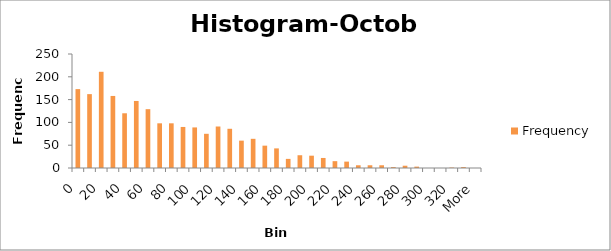
| Category | Frequency |
|---|---|
| 0 | 173 |
| 10 | 162 |
| 20 | 211 |
| 30 | 158 |
| 40 | 120 |
| 50 | 147 |
| 60 | 129 |
| 70 | 98 |
| 80 | 98 |
| 90 | 90 |
| 100 | 89 |
| 110 | 75 |
| 120 | 91 |
| 130 | 86 |
| 140 | 60 |
| 150 | 64 |
| 160 | 49 |
| 170 | 43 |
| 180 | 20 |
| 190 | 28 |
| 200 | 27 |
| 210 | 22 |
| 220 | 15 |
| 230 | 14 |
| 240 | 6 |
| 250 | 6 |
| 260 | 6 |
| 270 | 2 |
| 280 | 5 |
| 290 | 3 |
| 300 | 0 |
| 310 | 0 |
| 320 | 1 |
| 330 | 2 |
| More | 0 |